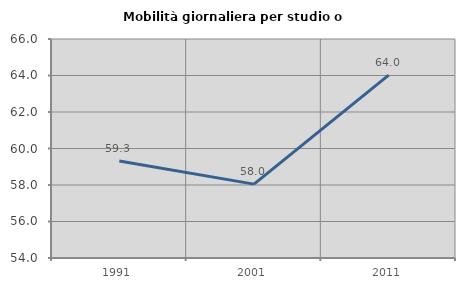
| Category | Mobilità giornaliera per studio o lavoro |
|---|---|
| 1991.0 | 59.318 |
| 2001.0 | 58.047 |
| 2011.0 | 64.021 |